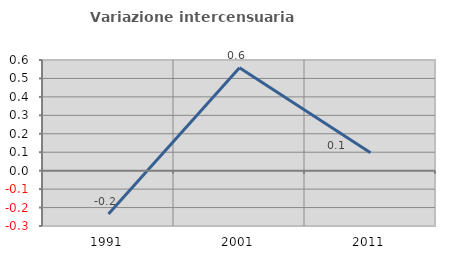
| Category | Variazione intercensuaria annua |
|---|---|
| 1991.0 | -0.235 |
| 2001.0 | 0.558 |
| 2011.0 | 0.097 |